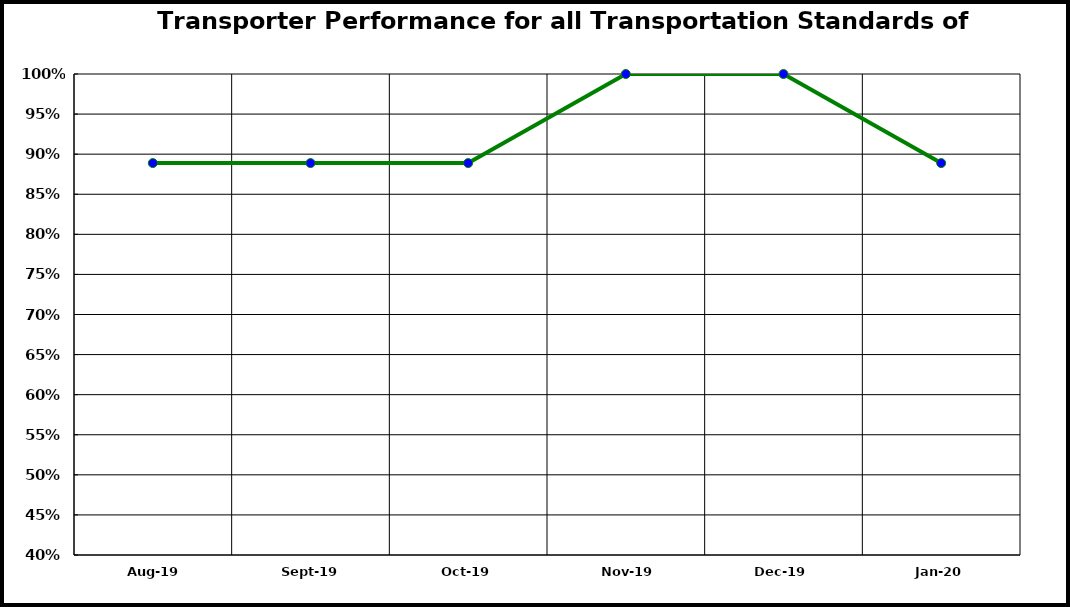
| Category | Performance |
|---|---|
| 2019-08-01 | 0.889 |
| 2019-09-01 | 0.889 |
| 2019-10-01 | 0.889 |
| 2019-11-01 | 1 |
| 2019-12-01 | 1 |
| 2020-01-01 | 0.889 |